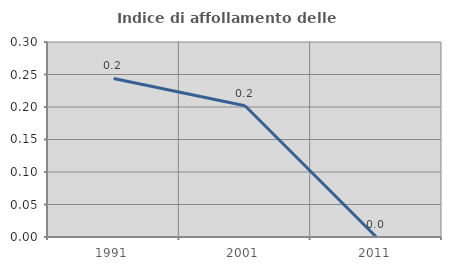
| Category | Indice di affollamento delle abitazioni  |
|---|---|
| 1991.0 | 0.244 |
| 2001.0 | 0.202 |
| 2011.0 | 0 |